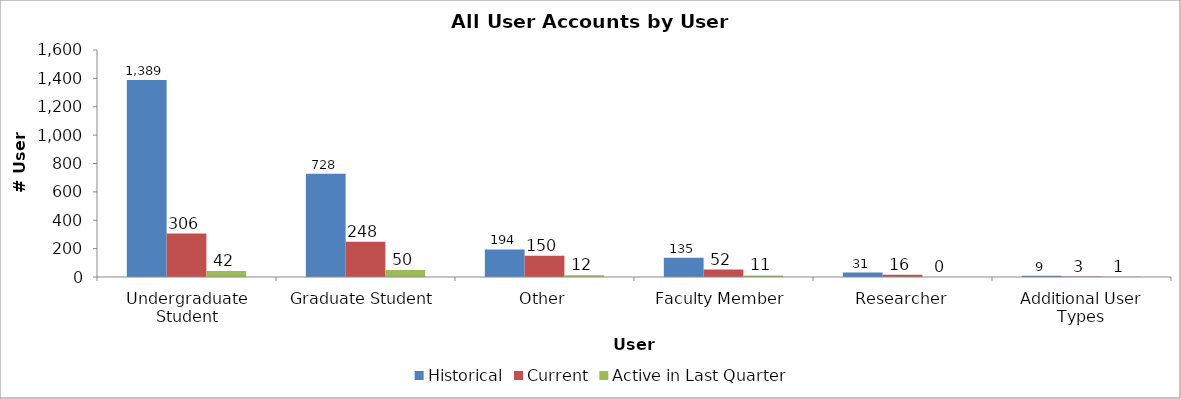
| Category | Historical | Current | Active in Last Quarter |
|---|---|---|---|
| Undergraduate Student | 1389 | 306 | 42 |
| Graduate Student | 728 | 248 | 50 |
| Other | 194 | 150 | 12 |
| Faculty Member | 135 | 52 | 11 |
| Researcher | 31 | 16 | 0 |
| Additional User Types | 9 | 3 | 1 |